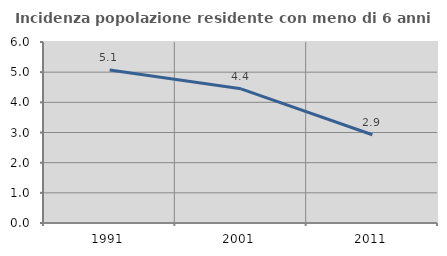
| Category | Incidenza popolazione residente con meno di 6 anni |
|---|---|
| 1991.0 | 5.075 |
| 2001.0 | 4.449 |
| 2011.0 | 2.925 |